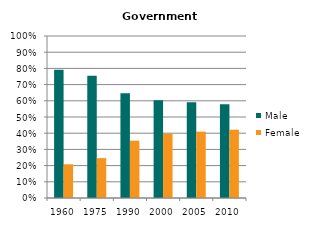
| Category | Male | Female |
|---|---|---|
| 1960.0 | 0.792 | 0.208 |
| 1975.0 | 0.754 | 0.246 |
| 1990.0 | 0.646 | 0.354 |
| 2000.0 | 0.603 | 0.397 |
| 2005.0 | 0.59 | 0.41 |
| 2010.0 | 0.578 | 0.422 |